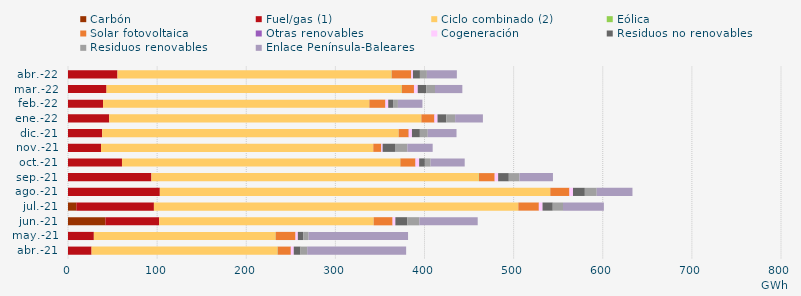
| Category | Carbón | Fuel/gas (1) | Ciclo combinado (2) | Eólica | Solar fotovoltaica | Otras renovables | Cogeneración | Residuos no renovables | Residuos renovables | Enlace Península-Baleares |
|---|---|---|---|---|---|---|---|---|---|---|
| abr.-21 | -0.591 | 26.435 | 208.531 | 0.295 | 14.715 | 0.106 | 3.221 | 7.539 | 7.539 | 111.022 |
| may.-21 | -1.103 | 28.997 | 203.813 | 0.19 | 22.208 | 0.119 | 2.572 | 6.024 | 6.024 | 111.602 |
| jun.-21 | 41.953 | 60.343 | 240.581 | 0.094 | 21.17 | 0.1 | 3.062 | 13.482 | 13.482 | 65.429 |
| jul.-21 | 9.293 | 87.1 | 408.794 | 0.106 | 22.966 | 0.096 | 4.086 | 11.473 | 11.473 | 45.879 |
| ago.-21 | -0.729 | 103.041 | 437.914 | 0.201 | 21.415 | 0.084 | 3.931 | 13.32 | 13.32 | 40.107 |
| sep.-21 | -0.55 | 93.586 | 367.241 | 0.274 | 17.622 | 0.081 | 3.819 | 11.973 | 11.973 | 37.549 |
| oct.-21 | -0.583 | 60.568 | 312.103 | 0.27 | 16.793 | 0.243 | 4.021 | 6.415 | 6.415 | 38.286 |
| nov.-21 | -0.582 | 37.046 | 305.438 | 0.061 | 8.81 | 0.24 | 1.412 | 13.868 | 13.868 | 28.436 |
| dic.-21 | -0.614 | 38.331 | 332.591 | 0.101 | 11.149 | 0.23 | 3.519 | 8.866 | 8.866 | 32.271 |
| ene.-22 | -0.627 | 46.217 | 350.083 | 0.216 | 14.423 | 0.285 | 3.401 | 9.871 | 9.871 | 31.159 |
| feb.-22 | -0.58 | 39.3 | 298.618 | 0.228 | 17.801 | 0.281 | 3.068 | 5.441 | 5.441 | 27.503 |
| mar.-22 | -0.669 | 43.217 | 330.995 | 0.338 | 13.606 | 0.291 | 3.993 | 9.663 | 9.663 | 30.689 |
| abr.-22 | -0.605 | 55.507 | 307.429 | 0.24 | 21.88 | 0.165 | 1.839 | 7.805 | 7.805 | 33.641 |